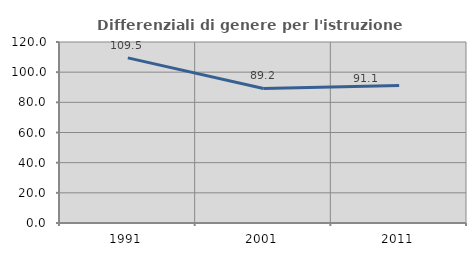
| Category | Differenziali di genere per l'istruzione superiore |
|---|---|
| 1991.0 | 109.478 |
| 2001.0 | 89.218 |
| 2011.0 | 91.14 |